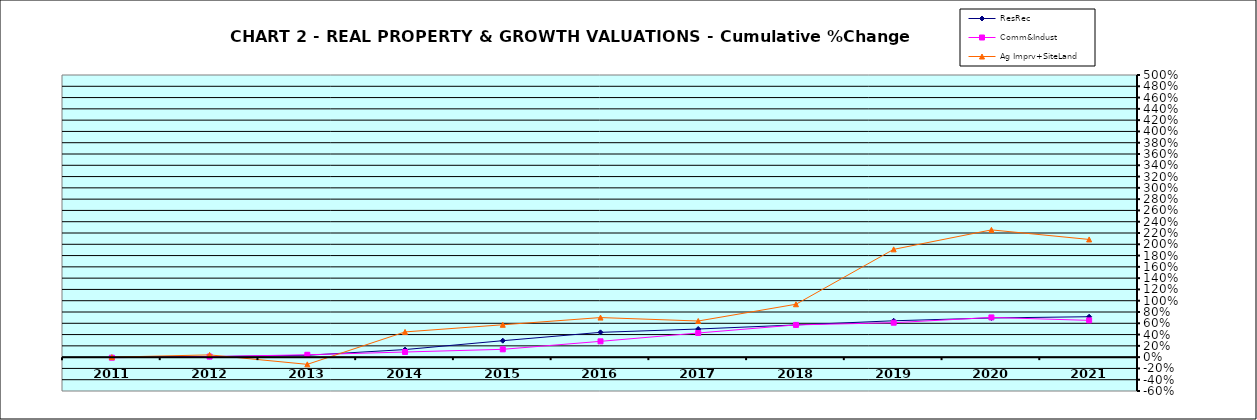
| Category | ResRec | Comm&Indust | Ag Imprv+SiteLand |
|---|---|---|---|
| 2011.0 | -0.005 | -0.01 | 0 |
| 2012.0 | 0.009 | 0.01 | 0.04 |
| 2013.0 | 0.033 | 0.042 | -0.128 |
| 2014.0 | 0.134 | 0.091 | 0.447 |
| 2015.0 | 0.291 | 0.139 | 0.574 |
| 2016.0 | 0.439 | 0.28 | 0.701 |
| 2017.0 | 0.498 | 0.428 | 0.64 |
| 2018.0 | 0.571 | 0.571 | 0.937 |
| 2019.0 | 0.645 | 0.61 | 1.91 |
| 2020.0 | 0.694 | 0.704 | 2.255 |
| 2021.0 | 0.717 | 0.651 | 2.086 |